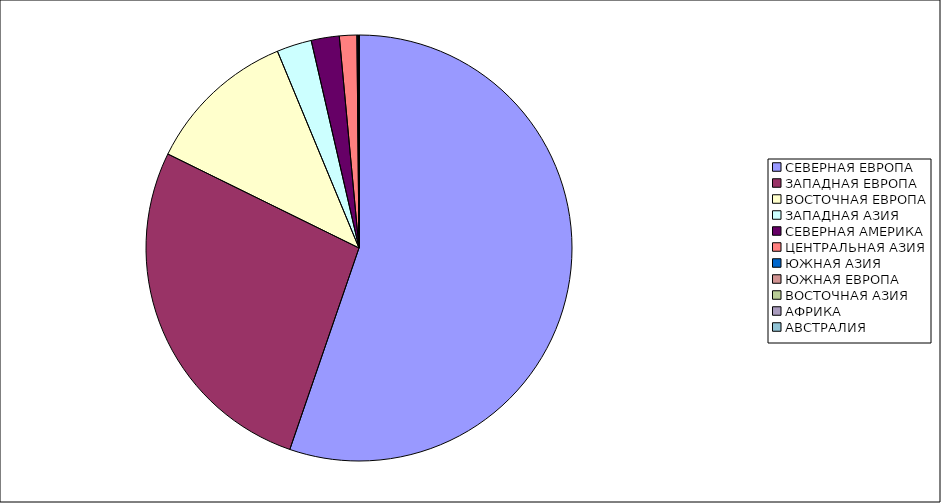
| Category | Оборот |
|---|---|
| СЕВЕРНАЯ ЕВРОПА | 55.264 |
| ЗАПАДНАЯ ЕВРОПА | 27.009 |
| ВОСТОЧНАЯ ЕВРОПА | 11.472 |
| ЗАПАДНАЯ АЗИЯ | 2.65 |
| СЕВЕРНАЯ АМЕРИКА | 2.128 |
| ЦЕНТРАЛЬНАЯ АЗИЯ | 1.322 |
| ЮЖНАЯ АЗИЯ | 0.078 |
| ЮЖНАЯ ЕВРОПА | 0.062 |
| ВОСТОЧНАЯ АЗИЯ | 0.008 |
| АФРИКА | 0.003 |
| АВСТРАЛИЯ | 0.003 |